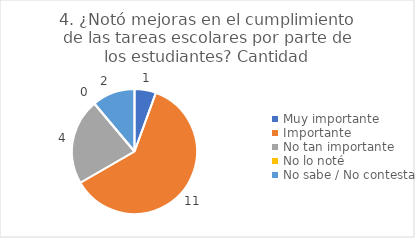
| Category | 4. ¿Notó mejoras en el cumplimiento de las tareas escolares por parte de los estudiantes? |
|---|---|
| Muy importante  | 0.056 |
| Importante  | 0.611 |
| No tan importante  | 0.222 |
| No lo noté  | 0 |
| No sabe / No contesta | 0.111 |